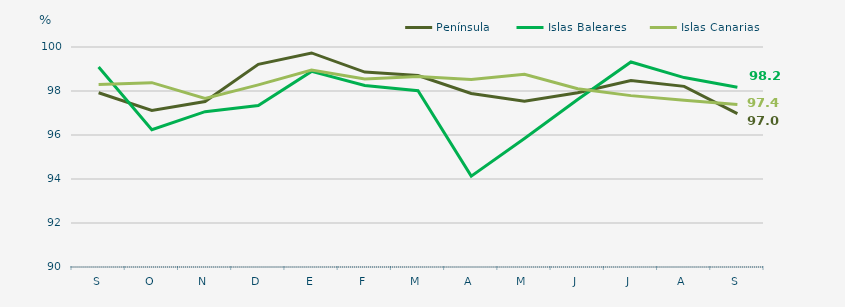
| Category | Península | Islas Baleares | Islas Canarias |
|---|---|---|---|
| S | 97.92 | 99.09 | 98.3 |
| O | 97.12 | 96.24 | 98.38 |
| N | 97.52 | 97.06 | 97.66 |
| D | 99.21 | 97.34 | 98.28 |
| E | 99.73 | 98.89 | 98.95 |
| F | 98.86 | 98.25 | 98.55 |
| M | 98.7 | 98.01 | 98.66 |
| A | 97.89 | 94.13 | 98.52 |
| M | 97.53 | 95.84 | 98.76 |
| J | 97.92 | 97.61 | 98.1 |
| J | 98.48 | 99.32 | 97.79 |
| A | 98.21 | 98.61 | 97.58 |
| S | 96.97 | 98.17 | 97.39 |